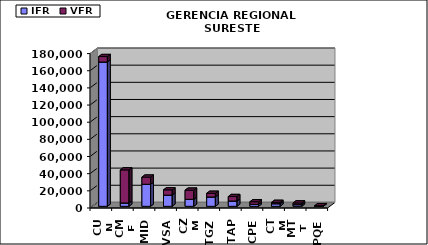
| Category | IFR | VFR |
|---|---|---|
| CUN | 168251 | 6325 |
| CME | 3917 | 38527 |
| MID | 25699 | 8327 |
| VSA | 13045 | 6158 |
| CZM | 8141 | 10675 |
| TGZ | 10899 | 4242 |
| TAP | 6190 | 5189 |
| CPE | 2367 | 2963 |
| CTM | 3052 | 1504 |
| MTT | 1960 | 1935 |
| PQE | 176 | 532 |